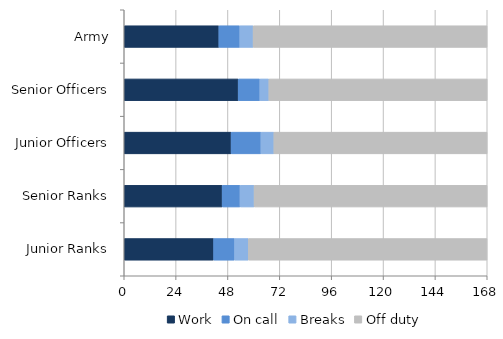
| Category | Work | On call | Breaks | Off duty |
|---|---|---|---|---|
| Army | 43.803 | 9.682 | 6.177 | 108.267 |
| Senior Officers | 52.738 | 10.019 | 4.197 | 101.021 |
| Junior Officers | 49.473 | 13.8 | 6.009 | 98.682 |
| Senior Ranks | 45.32 | 8.285 | 6.512 | 107.846 |
| Junior Ranks | 41.381 | 9.703 | 6.344 | 110.479 |